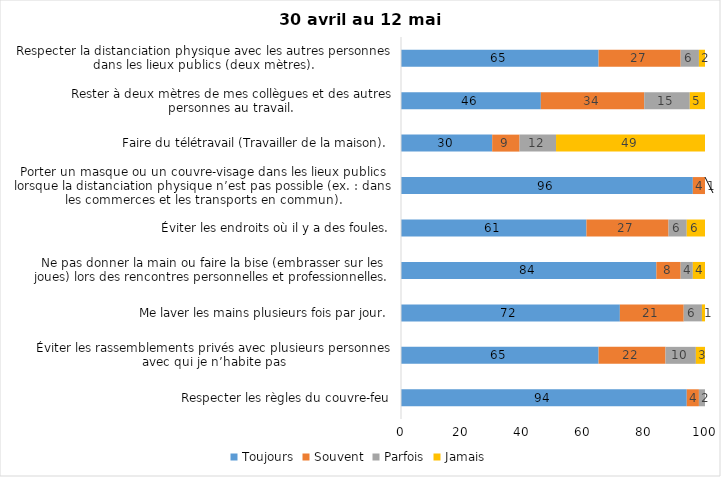
| Category | Toujours | Souvent | Parfois | Jamais |
|---|---|---|---|---|
| Respecter les règles du couvre-feu | 94 | 4 | 2 | 0 |
| Éviter les rassemblements privés avec plusieurs personnes avec qui je n’habite pas | 65 | 22 | 10 | 3 |
| Me laver les mains plusieurs fois par jour. | 72 | 21 | 6 | 1 |
| Ne pas donner la main ou faire la bise (embrasser sur les joues) lors des rencontres personnelles et professionnelles. | 84 | 8 | 4 | 4 |
| Éviter les endroits où il y a des foules. | 61 | 27 | 6 | 6 |
| Porter un masque ou un couvre-visage dans les lieux publics lorsque la distanciation physique n’est pas possible (ex. : dans les commerces et les transports en commun). | 96 | 4 | 1 | 0 |
| Faire du télétravail (Travailler de la maison). | 30 | 9 | 12 | 49 |
| Rester à deux mètres de mes collègues et des autres personnes au travail. | 46 | 34 | 15 | 5 |
| Respecter la distanciation physique avec les autres personnes dans les lieux publics (deux mètres). | 65 | 27 | 6 | 2 |